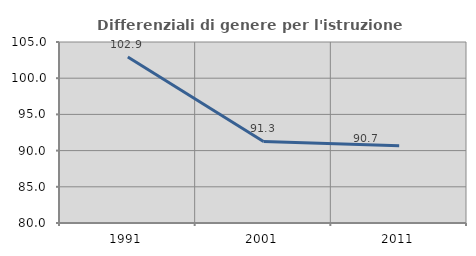
| Category | Differenziali di genere per l'istruzione superiore |
|---|---|
| 1991.0 | 102.927 |
| 2001.0 | 91.269 |
| 2011.0 | 90.679 |